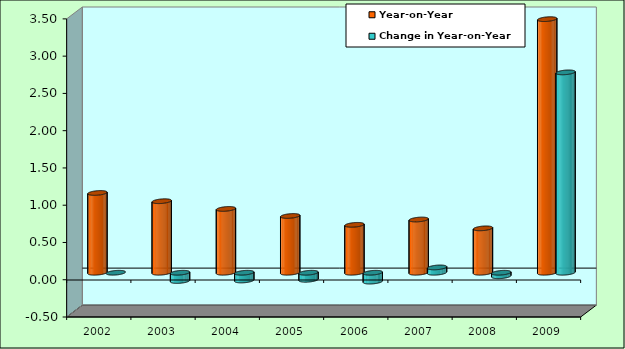
| Category | Year-on-Year | Change in Year-on-Year |
|---|---|---|
| 2002 | 1.071 | 0 |
| 2003 | 0.96 | -0.111 |
| 2004 | 0.856 | -0.104 |
| 2005 | 0.762 | -0.094 |
| 2006 | 0.643 | -0.119 |
| 2007 | 0.714 | 0.072 |
| 2008 | 0.596 | -0.047 |
| 2009 | 3.403 | 2.688 |